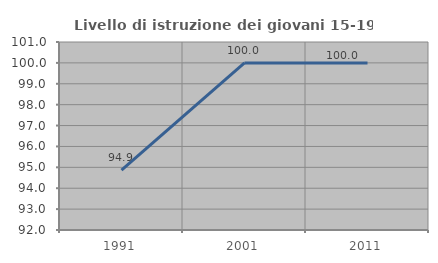
| Category | Livello di istruzione dei giovani 15-19 anni |
|---|---|
| 1991.0 | 94.872 |
| 2001.0 | 100 |
| 2011.0 | 100 |